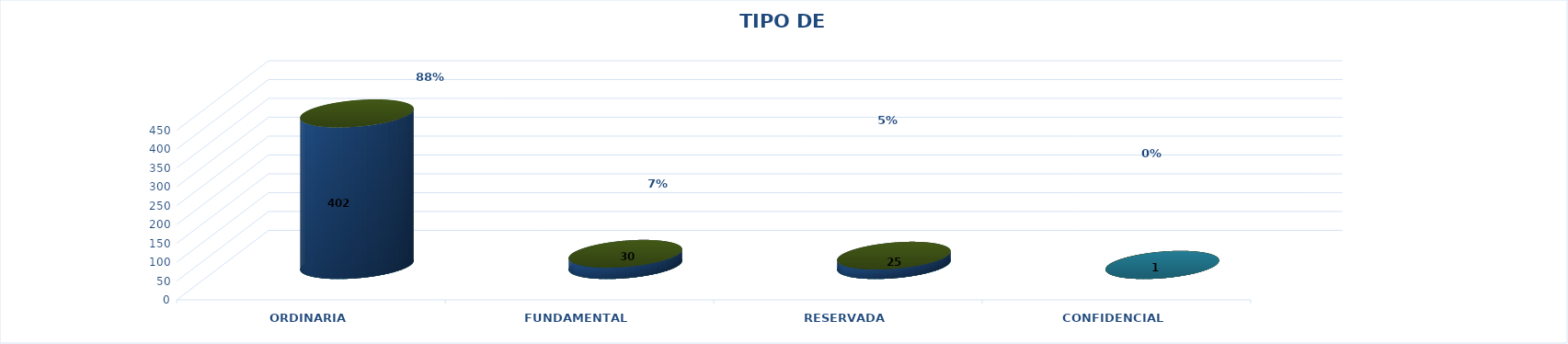
| Category | Series 0 | Series 2 | Series 1 | Series 3 | Series 4 |
|---|---|---|---|---|---|
| ORDINARIA |  |  |  | 402 | 0.878 |
| FUNDAMENTAL |  |  |  | 30 | 0.066 |
| RESERVADA |  |  |  | 25 | 0.055 |
| CONFIDENCIAL |  |  |  | 1 | 0.002 |